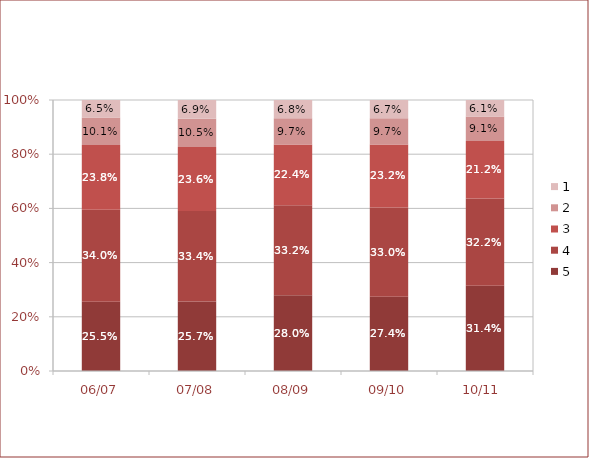
| Category | 5 | 4 | 3 | 2 | 1 |
|---|---|---|---|---|---|
| 06/07 | 0.255 | 0.34 | 0.238 | 0.101 | 0.065 |
| 07/08 | 0.257 | 0.334 | 0.236 | 0.105 | 0.069 |
| 08/09 | 0.28 | 0.332 | 0.224 | 0.097 | 0.068 |
| 09/10 | 0.274 | 0.33 | 0.232 | 0.097 | 0.067 |
| 10/11  | 0.314 | 0.322 | 0.212 | 0.091 | 0.061 |